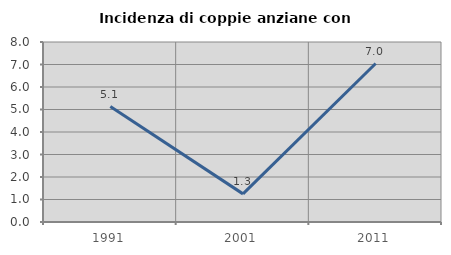
| Category | Incidenza di coppie anziane con figli |
|---|---|
| 1991.0 | 5.128 |
| 2001.0 | 1.25 |
| 2011.0 | 7.042 |